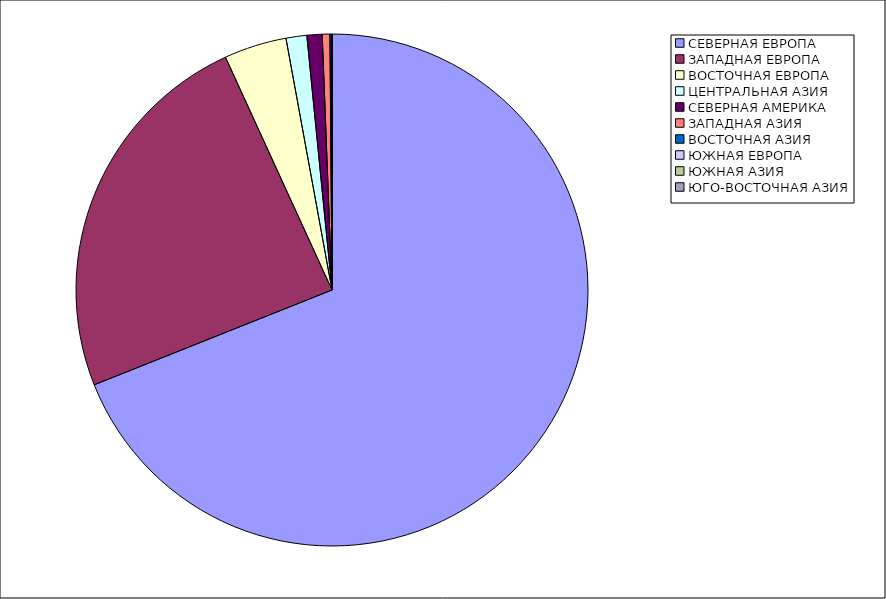
| Category | Оборот |
|---|---|
| СЕВЕРНАЯ ЕВРОПА | 68.96 |
| ЗАПАДНАЯ ЕВРОПА | 24.21 |
| ВОСТОЧНАЯ ЕВРОПА | 3.95 |
| ЦЕНТРАЛЬНАЯ АЗИЯ | 1.31 |
| СЕВЕРНАЯ АМЕРИКА | 0.96 |
| ЗАПАДНАЯ АЗИЯ | 0.48 |
| ВОСТОЧНАЯ АЗИЯ | 0.12 |
| ЮЖНАЯ ЕВРОПА | 0.01 |
| ЮЖНАЯ АЗИЯ | 0 |
| ЮГО-ВОСТОЧНАЯ АЗИЯ | 0 |